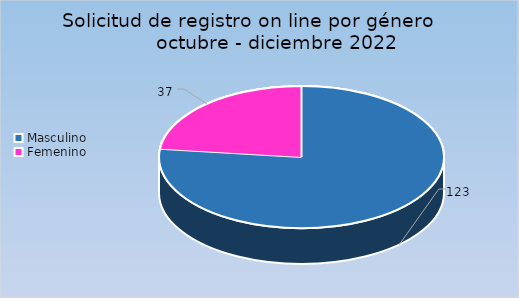
| Category | Cantidad |
|---|---|
| Masculino | 123 |
| Femenino | 37 |